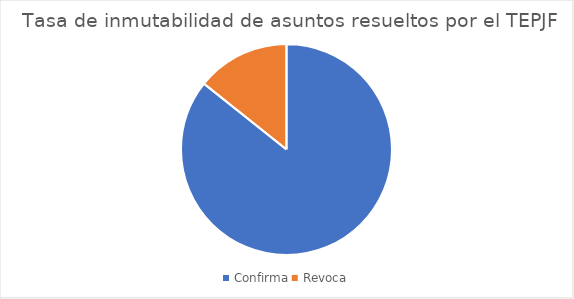
| Category | Tasa de inmutabilidad de asuntos resueltos por el TEPJF |
|---|---|
| Confirma | 6 |
| Revoca | 1 |